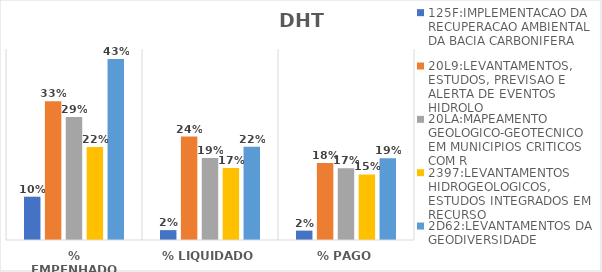
| Category | 125F:IMPLEMENTACAO DA RECUPERACAO AMBIENTAL DA BACIA CARBONIFERA | 20L9:LEVANTAMENTOS, ESTUDOS, PREVISAO E ALERTA DE EVENTOS HIDROLO | 20LA:MAPEAMENTO GEOLOGICO-GEOTECNICO EM MUNICIPIOS CRITICOS COM R | 2397:LEVANTAMENTOS HIDROGEOLOGICOS, ESTUDOS INTEGRADOS EM RECURSO | 2D62:LEVANTAMENTOS DA GEODIVERSIDADE |
|---|---|---|---|---|---|
| % EMPENHADO | 0.102 | 0.327 | 0.29 | 0.219 | 0.427 |
| % LIQUIDADO | 0.023 | 0.244 | 0.193 | 0.169 | 0.22 |
| % PAGO | 0.022 | 0.181 | 0.169 | 0.154 | 0.192 |